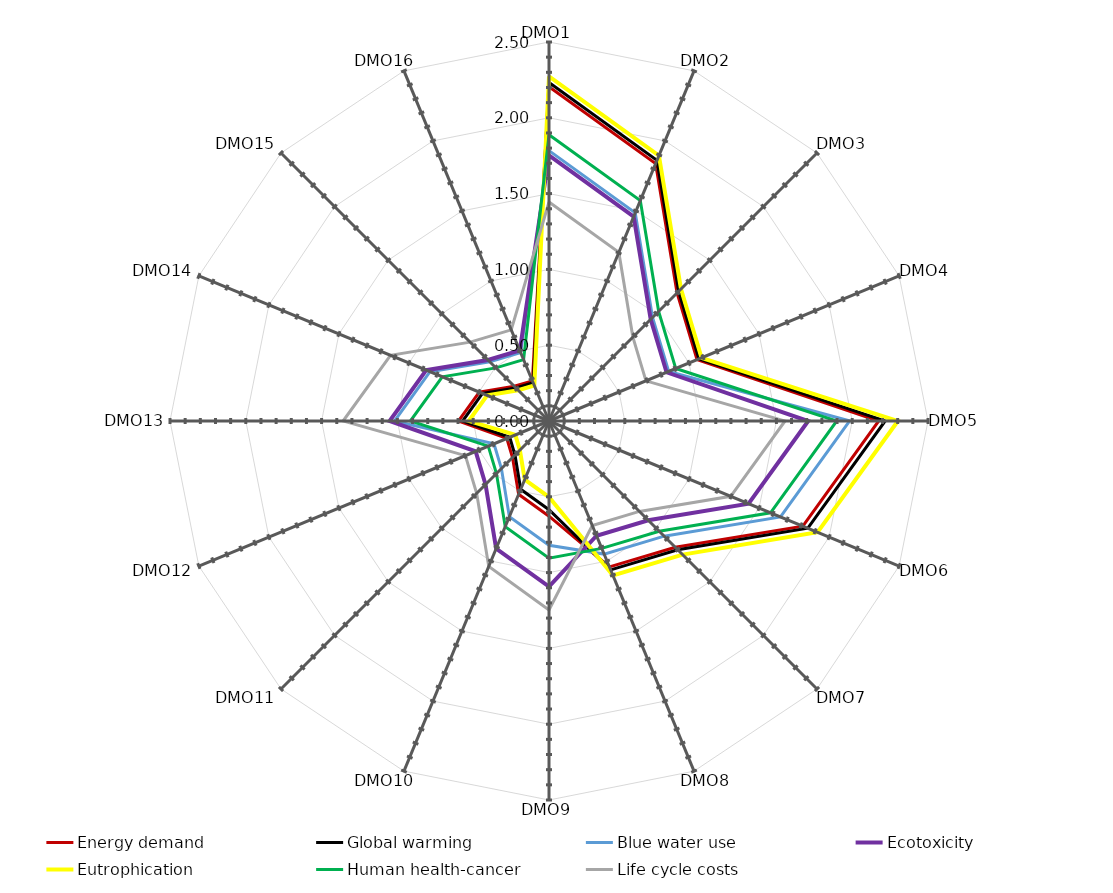
| Category | Energy demand   | Global warming  | Blue water use | Ecotoxicity | Eutrophication | Human health-cancer | Life cycle costs |
|---|---|---|---|---|---|---|---|
| DMO1 | 2.205 | 2.233 | 1.783 | 1.751 | 2.273 | 1.888 | 1.445 |
| DMO2 | 1.838 | 1.861 | 1.486 | 1.459 | 1.894 | 1.574 | 1.204 |
| DMO3 | 1.195 | 1.21 | 0.966 | 0.949 | 1.231 | 1.023 | 0.783 |
| DMO4 | 1.057 | 1.07 | 0.855 | 0.839 | 1.089 | 0.905 | 0.692 |
| DMO5 | 2.175 | 2.218 | 1.983 | 1.71 | 2.301 | 1.898 | 1.557 |
| DMO6 | 1.812 | 1.848 | 1.653 | 1.425 | 1.918 | 1.582 | 1.297 |
| DMO7 | 1.178 | 1.201 | 1.074 | 0.926 | 1.247 | 1.028 | 0.843 |
| DMO8 | 1.042 | 1.063 | 0.95 | 0.819 | 1.103 | 0.909 | 0.746 |
| DMO9 | 0.628 | 0.585 | 0.82 | 1.093 | 0.501 | 0.905 | 1.246 |
| DMO10 | 0.523 | 0.488 | 0.683 | 0.911 | 0.418 | 0.754 | 1.038 |
| DMO11 | 0.34 | 0.317 | 0.444 | 0.592 | 0.272 | 0.49 | 0.675 |
| DMO12 | 0.301 | 0.28 | 0.393 | 0.524 | 0.24 | 0.434 | 0.597 |
| DMO13 | 0.598 | 0.57 | 1.019 | 1.052 | 0.53 | 0.914 | 1.358 |
| DMO14 | 0.498 | 0.475 | 0.85 | 0.876 | 0.441 | 0.762 | 1.132 |
| DMO15 | 0.324 | 0.309 | 0.552 | 0.57 | 0.287 | 0.495 | 0.736 |
| DMO16 | 0.286 | 0.273 | 0.488 | 0.504 | 0.254 | 0.438 | 0.651 |